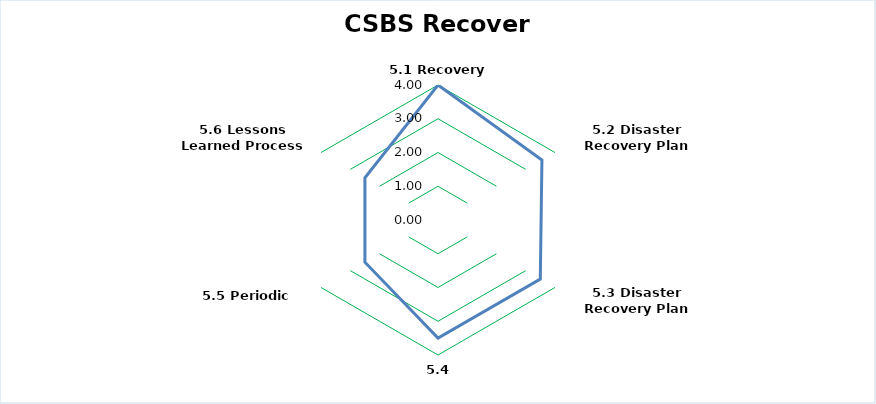
| Category | Recover |
|---|---|
| 5.1 Recovery Points | 4 |
| 5.2 Disaster Recovery Plan (DRP) | 3.556 |
| 5.3 Disaster Recovery Plan Practise (DRP) | 3.5 |
| 5.4 Post-Incident | 3.5 |
| 5.5 Periodic Review | 2.5 |
| 5.6 Lessons Learned Process | 2.5 |